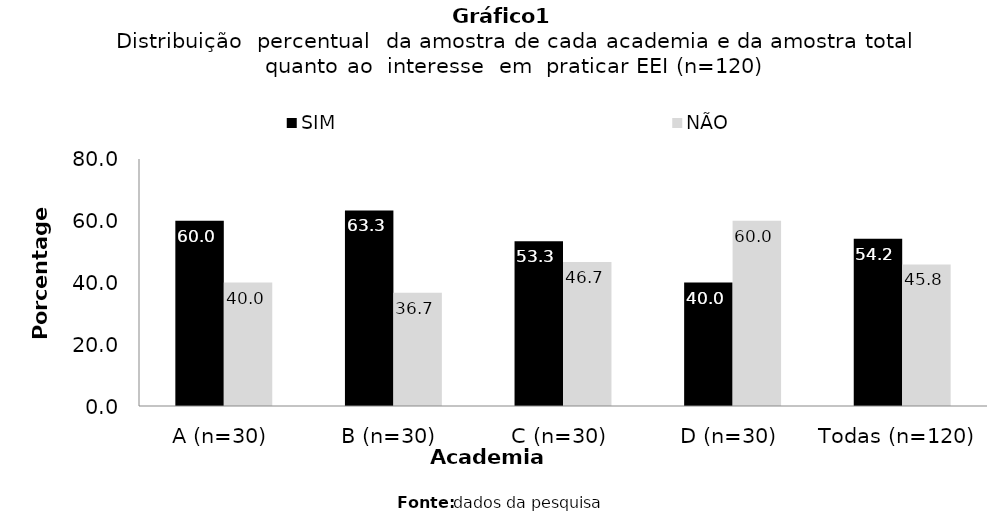
| Category | SIM | NÃO |
|---|---|---|
| A (n=30) | 60 | 40 |
| B (n=30) | 63.333 | 36.667 |
| C (n=30) | 53.333 | 46.667 |
| D (n=30) | 40 | 60 |
| Todas (n=120) | 54.167 | 45.833 |